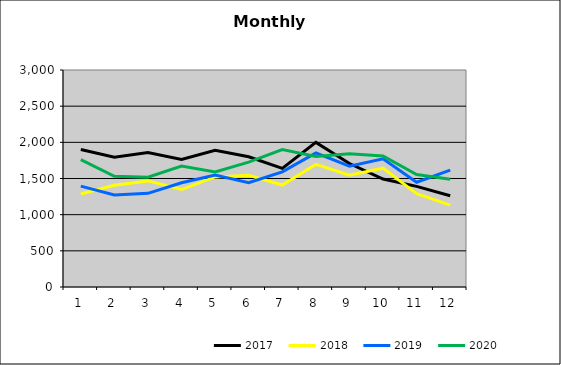
| Category | 2017 | 2018 | 2019 | 2020 |
|---|---|---|---|---|
| 0 | 1900.859 | 1286.21 | 1394.576 | 1762.064 |
| 1 | 1795.105 | 1406.556 | 1272.617 | 1530.829 |
| 2 | 1859.386 | 1466.695 | 1295.231 | 1518.163 |
| 3 | 1764.013 | 1347.408 | 1441.267 | 1671.58 |
| 4 | 1891.399 | 1522.181 | 1548.691 | 1589.128 |
| 5 | 1800.236 | 1543.945 | 1443.46 | 1725.706 |
| 6 | 1640.121 | 1409.491 | 1591.615 | 1898.774 |
| 7 | 1999.331 | 1694.901 | 1854.799 | 1803.166 |
| 8 | 1706.874 | 1545.104 | 1671.028 | 1843.578 |
| 9 | 1492.036 | 1642.816 | 1771.378 | 1810.413 |
| 10 | 1390.86 | 1288.934 | 1448.517 | 1553.864 |
| 11 | 1261.902 | 1131.485 | 1616.657 | 1488.683 |